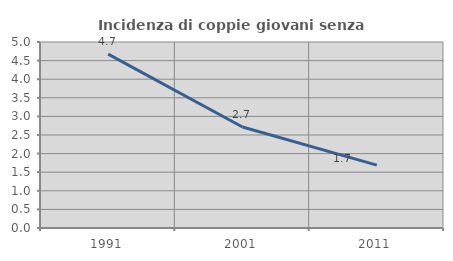
| Category | Incidenza di coppie giovani senza figli |
|---|---|
| 1991.0 | 4.673 |
| 2001.0 | 2.716 |
| 2011.0 | 1.69 |